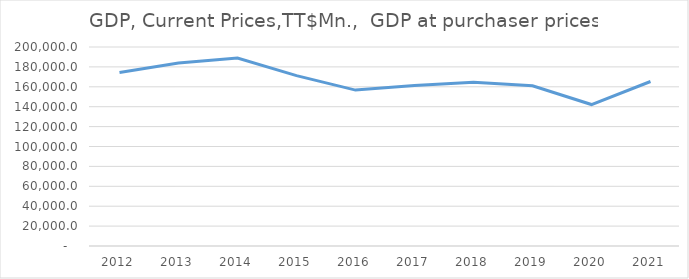
| Category | GDP at purchaser prices |
|---|---|
| 2012.0 | 174381.834 |
| 2013.0 | 183985.074 |
| 2014.0 | 188997.872 |
| 2015.0 | 171246.874 |
| 2016.0 | 156695.481 |
| 2017.0 | 161337.014 |
| 2018.0 | 164680.634 |
| 2019.0 | 161087.705 |
| 2020.0 | 142173.314 |
| 2021.0 | 165314.972 |